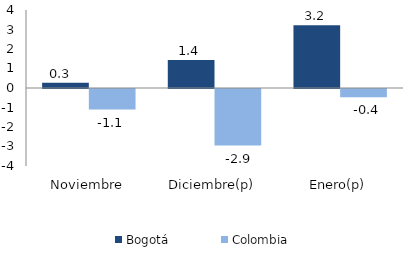
| Category | Bogotá | Colombia |
|---|---|---|
| Noviembre | 0.268 | -1.054 |
| Diciembre(p) | 1.442 | -2.898 |
| Enero(p) | 3.223 | -0.423 |